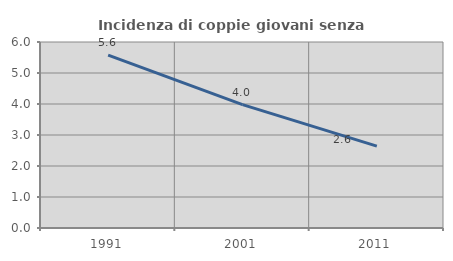
| Category | Incidenza di coppie giovani senza figli |
|---|---|
| 1991.0 | 5.575 |
| 2001.0 | 3.981 |
| 2011.0 | 2.642 |